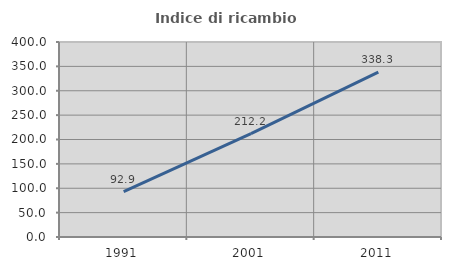
| Category | Indice di ricambio occupazionale  |
|---|---|
| 1991.0 | 92.857 |
| 2001.0 | 212.222 |
| 2011.0 | 338.333 |